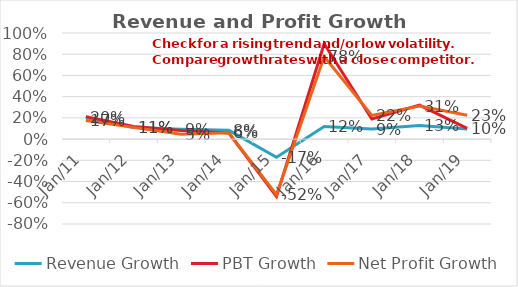
| Category | Revenue Growth | PBT Growth | Net Profit Growth |
|---|---|---|---|
| 2011-12-31 | 0.201 | 0.212 | 0.175 |
| 2012-12-31 | 0.109 | 0.119 | 0.111 |
| 2013-12-31 | 0.092 | 0.081 | 0.046 |
| 2014-12-31 | 0.083 | 0.057 | 0.06 |
| 2015-12-31 | -0.17 | -0.541 | -0.525 |
| 2016-12-31 | 0.118 | 0.899 | 0.778 |
| 2017-12-31 | 0.095 | 0.19 | 0.224 |
| 2018-12-31 | 0.128 | 0.321 | 0.312 |
| 2019-12-31 | 0.095 | 0.101 | 0.226 |